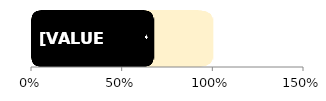
| Category | total | Men |
|---|---|---|
| 0 | 1 | 0.674 |